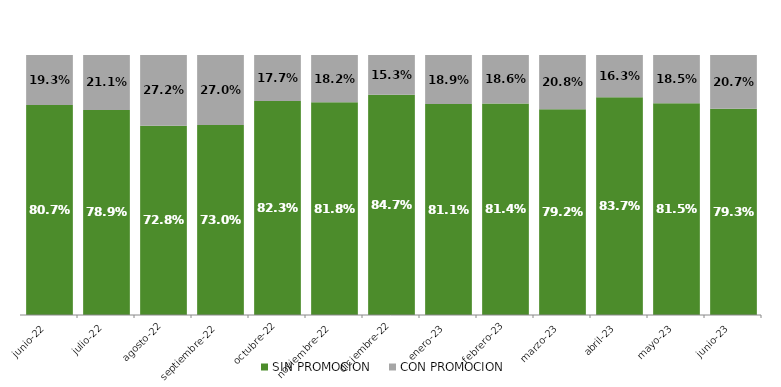
| Category | SIN PROMOCION   | CON PROMOCION   |
|---|---|---|
| 2022-06-01 | 0.807 | 0.193 |
| 2022-07-01 | 0.789 | 0.211 |
| 2022-08-01 | 0.728 | 0.272 |
| 2022-09-01 | 0.73 | 0.27 |
| 2022-10-01 | 0.823 | 0.177 |
| 2022-11-01 | 0.818 | 0.182 |
| 2022-12-01 | 0.847 | 0.153 |
| 2023-01-01 | 0.811 | 0.189 |
| 2023-02-01 | 0.814 | 0.186 |
| 2023-03-01 | 0.792 | 0.208 |
| 2023-04-01 | 0.837 | 0.163 |
| 2023-05-01 | 0.815 | 0.185 |
| 2023-06-01 | 0.793 | 0.207 |